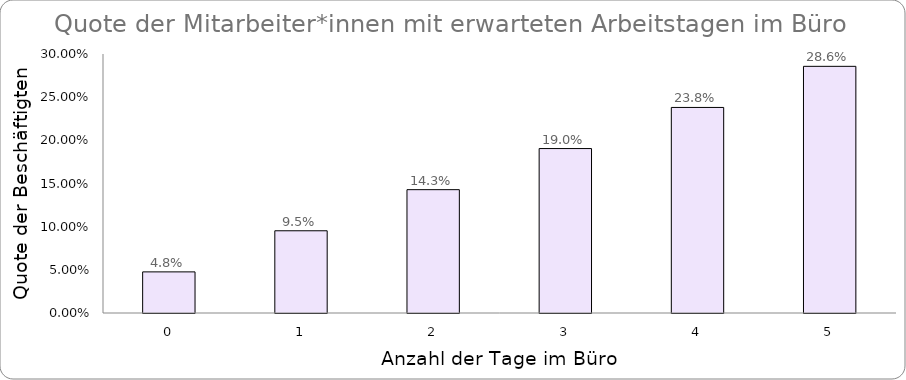
| Category | Series 0 |
|---|---|
| 0.0 | 0.048 |
| 1.0 | 0.095 |
| 2.0 | 0.143 |
| 3.0 | 0.19 |
| 4.0 | 0.238 |
| 5.0 | 0.286 |